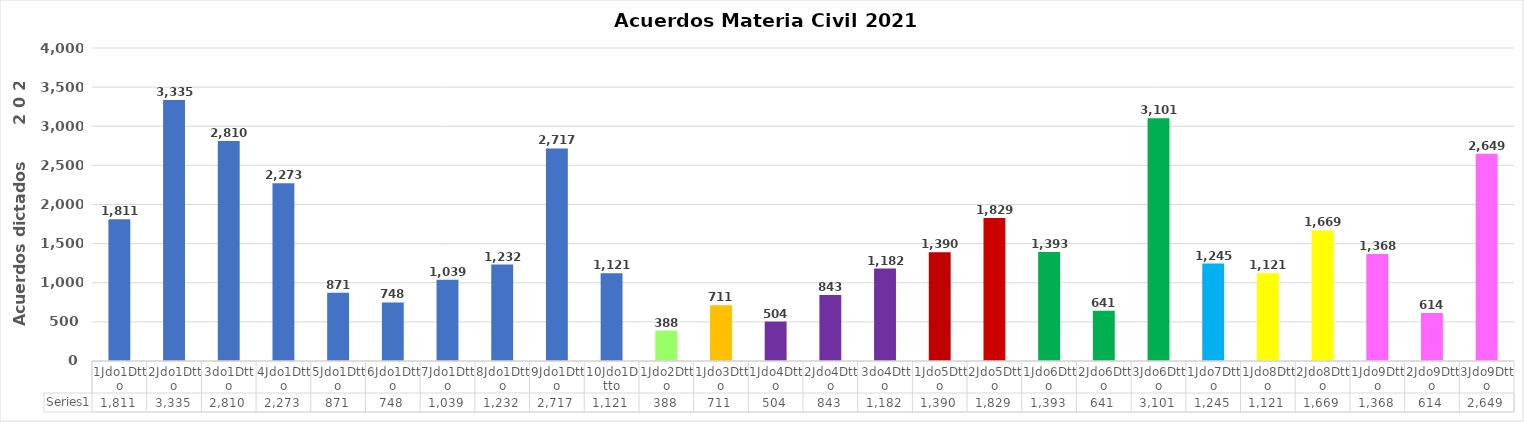
| Category | Series 0 |
|---|---|
| 1Jdo1Dtto | 1811 |
| 2Jdo1Dtto | 3335 |
| 3do1Dtto | 2810 |
| 4Jdo1Dtto | 2273 |
| 5Jdo1Dtto | 871 |
| 6Jdo1Dtto | 748 |
| 7Jdo1Dtto | 1039 |
| 8Jdo1Dtto | 1232 |
| 9Jdo1Dtto | 2717 |
| 10Jdo1Dtto | 1121 |
| 1Jdo2Dtto | 388 |
| 1Jdo3Dtto | 711 |
| 1Jdo4Dtto | 504 |
| 2Jdo4Dtto | 843 |
| 3do4Dtto | 1182 |
| 1Jdo5Dtto | 1390 |
| 2Jdo5Dtto | 1829 |
| 1Jdo6Dtto | 1393 |
| 2Jdo6Dtto | 641 |
| 3Jdo6Dtto | 3101 |
| 1Jdo7Dtto | 1245 |
| 1Jdo8Dtto | 1121 |
| 2Jdo8Dtto | 1669 |
| 1Jdo9Dtto | 1368 |
| 2Jdo9Dtto | 614 |
| 3Jdo9Dtto | 2649 |